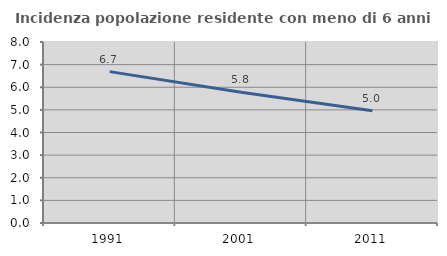
| Category | Incidenza popolazione residente con meno di 6 anni |
|---|---|
| 1991.0 | 6.69 |
| 2001.0 | 5.781 |
| 2011.0 | 4.961 |